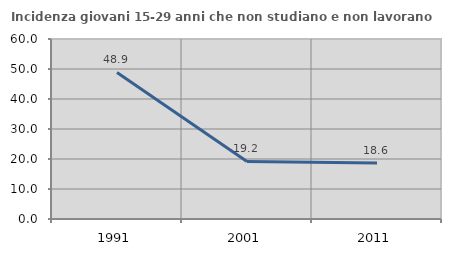
| Category | Incidenza giovani 15-29 anni che non studiano e non lavorano  |
|---|---|
| 1991.0 | 48.853 |
| 2001.0 | 19.169 |
| 2011.0 | 18.634 |